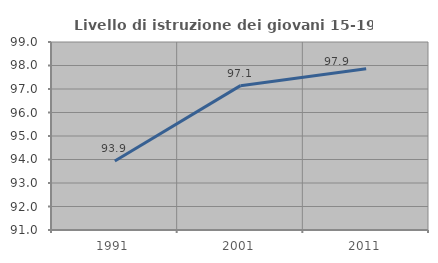
| Category | Livello di istruzione dei giovani 15-19 anni |
|---|---|
| 1991.0 | 93.939 |
| 2001.0 | 97.143 |
| 2011.0 | 97.857 |